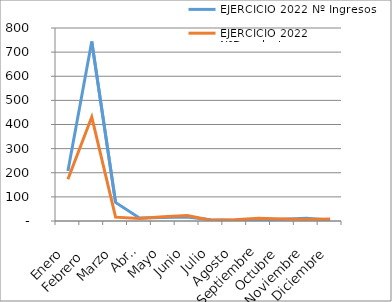
| Category | EJERCICIO 2022 |
|---|---|
| Enero | 173 |
| Febrero  | 431 |
| Marzo | 16 |
| Abril | 10 |
| Mayo | 18 |
| Junio | 23 |
| Julio | 3 |
| Agosto | 5 |
| Septiembre | 11 |
| Octubre | 8 |
| Noviembre | 6 |
| Diciembre | 8 |